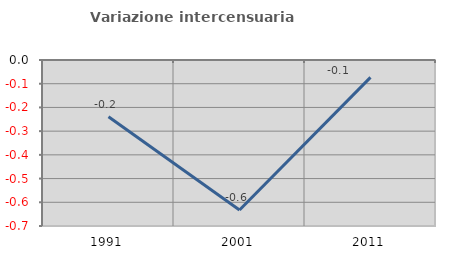
| Category | Variazione intercensuaria annua |
|---|---|
| 1991.0 | -0.239 |
| 2001.0 | -0.633 |
| 2011.0 | -0.073 |